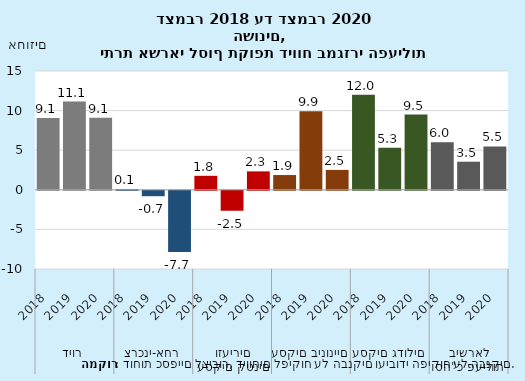
| Category | Series 0 |
|---|---|
| 0 | 9.076 |
| 1 | 11.135 |
| 2 | 9.109 |
| 3 | 0.087 |
| 4 | -0.683 |
| 5 | -7.726 |
| 6 | 1.767 |
| 7 | -2.515 |
| 8 | 2.327 |
| 9 | 1.863 |
| 10 | 9.909 |
| 11 | 2.512 |
| 12 | 12.007 |
| 13 | 5.324 |
| 14 | 9.497 |
| 15 | 5.996 |
| 16 | 3.547 |
| 17 | 5.468 |